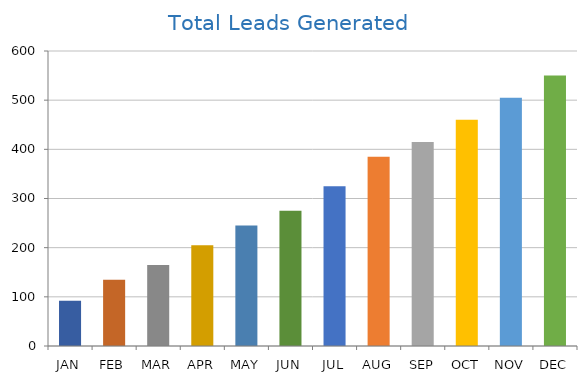
| Category | Total |
|---|---|
| JAN | 92 |
| FEB | 135 |
| MAR | 165 |
| APR | 205 |
| MAY | 245 |
| JUN | 275 |
| JUL | 325 |
| AUG | 385 |
| SEP | 415 |
| OCT | 460 |
| NOV | 505 |
| DEC | 550 |